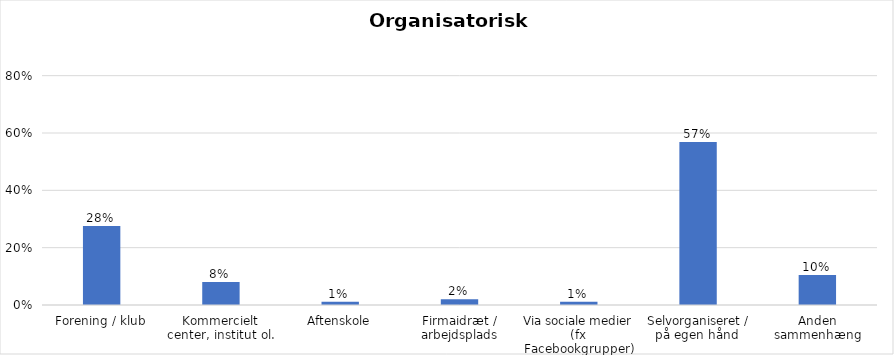
| Category | % |
|---|---|
| Forening / klub | 0.276 |
| Kommercielt center, institut ol. | 0.08 |
| Aftenskole | 0.011 |
| Firmaidræt / arbejdsplads | 0.02 |
| Via sociale medier (fx Facebookgrupper) | 0.011 |
| Selvorganiseret / på egen hånd  | 0.569 |
| Anden sammenhæng | 0.104 |